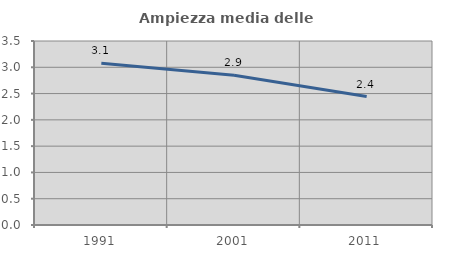
| Category | Ampiezza media delle famiglie |
|---|---|
| 1991.0 | 3.075 |
| 2001.0 | 2.85 |
| 2011.0 | 2.443 |